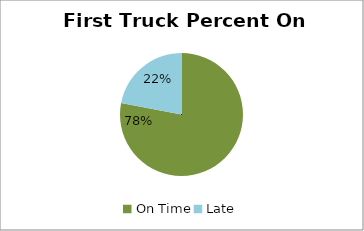
| Category | Series 0 |
|---|---|
| On Time | 0.78 |
| Late | 0.22 |